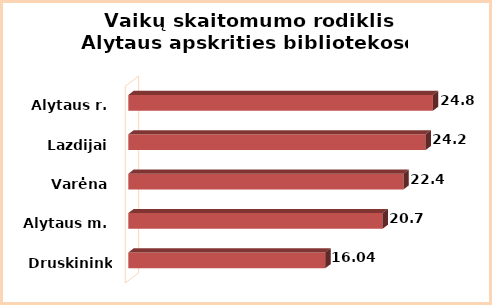
| Category | Series 0 |
|---|---|
| Druskininkai | 16.04 |
| Alytaus m. | 20.7 |
| Varėna | 22.4 |
| Lazdijai | 24.2 |
| Alytaus r. | 24.8 |